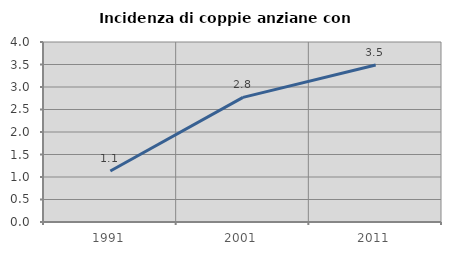
| Category | Incidenza di coppie anziane con figli |
|---|---|
| 1991.0 | 1.132 |
| 2001.0 | 2.769 |
| 2011.0 | 3.488 |